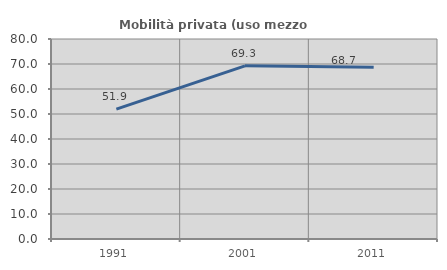
| Category | Mobilità privata (uso mezzo privato) |
|---|---|
| 1991.0 | 51.924 |
| 2001.0 | 69.269 |
| 2011.0 | 68.7 |